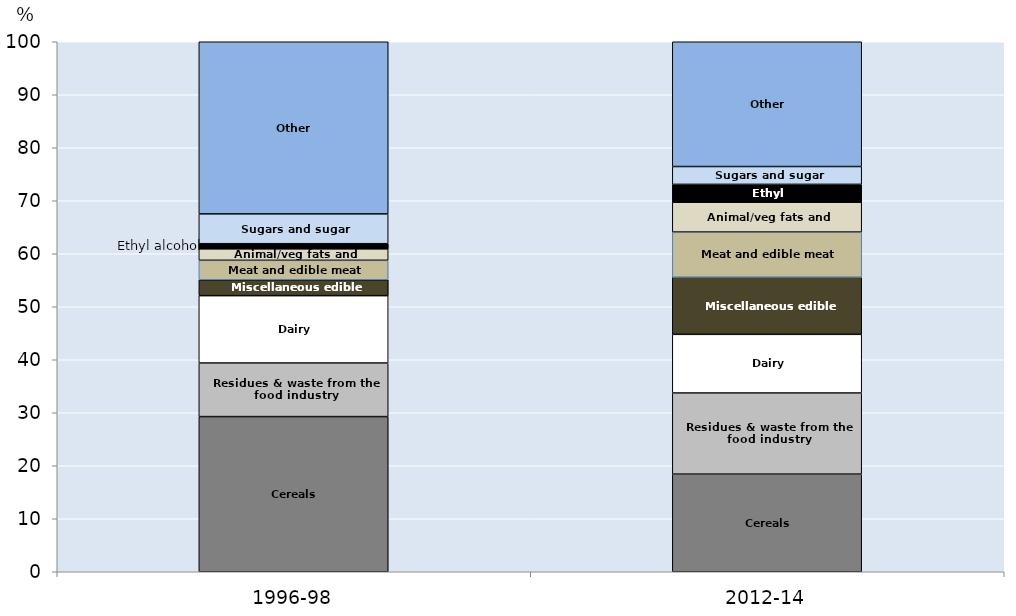
| Category | Cereals | Residues & waste from the food industry | Dairy products | Miscellaneous edible preparations. | Meat and edible meat offal | Animal/veg fats and oils  | Ethyl alcohol | Sugars and sugar confectionery | Other |
|---|---|---|---|---|---|---|---|---|---|
| 1996-98 | 29.277 | 10.112 | 12.706 | 2.996 | 3.673 | 2.163 | 0.969 | 5.622 | 32.481 |
| 2012-14 | 18.418 | 15.313 | 11.065 | 10.782 | 8.516 | 5.633 | 3.364 | 3.368 | 23.542 |